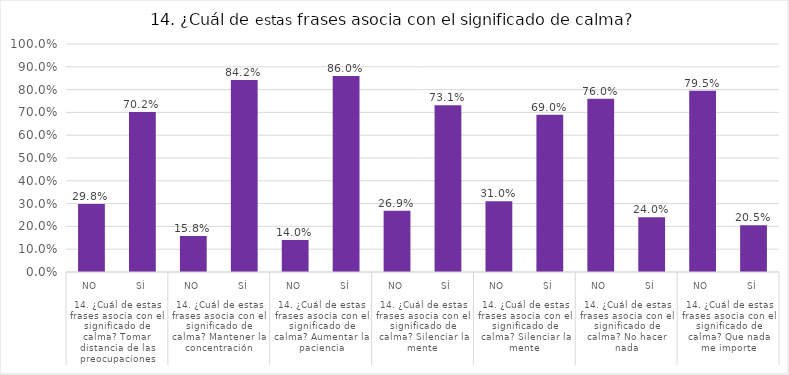
| Category | % del N de columna |
|---|---|
| 0 | 0.298 |
| 1 | 0.702 |
| 2 | 0.158 |
| 3 | 0.842 |
| 4 | 0.14 |
| 5 | 0.86 |
| 6 | 0.269 |
| 7 | 0.731 |
| 8 | 0.31 |
| 9 | 0.69 |
| 10 | 0.76 |
| 11 | 0.24 |
| 12 | 0.795 |
| 13 | 0.205 |